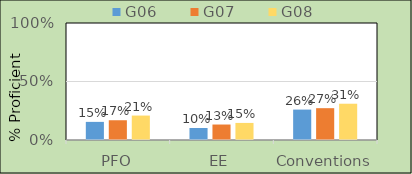
| Category | G06 | G07 | G08 |
|---|---|---|---|
| PFO | 15.486 | 16.886 | 20.886 |
| EE | 10.275 | 13.226 | 14.597 |
| Conventions | 25.988 | 27.2 | 31.006 |